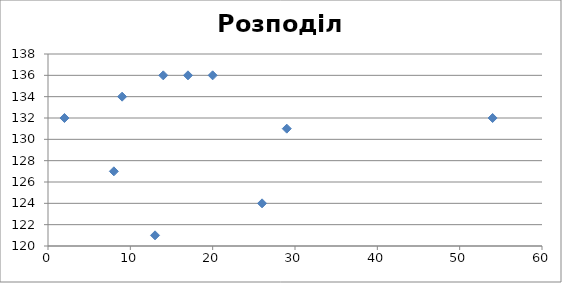
| Category | Розподіл значень |
|---|---|
| 29.0 | 131 |
| 54.0 | 132 |
| 13.0 | 121 |
| 8.0 | 127 |
| 14.0 | 136 |
| 26.0 | 124 |
| 9.0 | 134 |
| 20.0 | 136 |
| 2.0 | 132 |
| 17.0 | 136 |